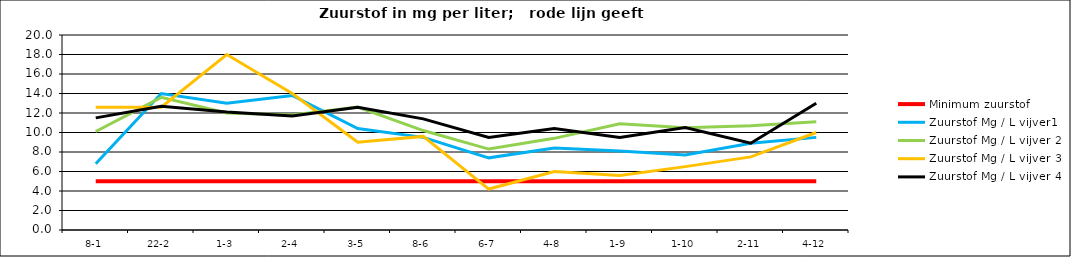
| Category | Minimum zuurstof | Zuurstof Mg / L vijver1 | Zuurstof Mg / L vijver 2 | Zuurstof Mg / L vijver 3 | Zuurstof Mg / L vijver 4 |
|---|---|---|---|---|---|
| 8-1 | 5 | 6.8 | 10.1 | 12.6 | 11.5 |
| 22-2 | 5 | 14 | 13.6 | 12.6 | 12.7 |
| 1-3 | 5 | 13 | 12 | 18 | 12.1 |
| 2-4 | 5 | 13.8 | 11.8 | 14 | 11.7 |
| 3-5 | 5 | 10.4 | 12.6 | 9 | 12.6 |
| 8-6 | 5 | 9.5 | 10.2 | 9.6 | 11.4 |
| 6-7 | 5 | 7.4 | 8.3 | 4.2 | 9.5 |
| 4-8 | 5 | 8.4 | 9.4 | 6 | 10.4 |
| 1-9 | 5 | 8.1 | 10.9 | 5.6 | 9.5 |
| 1-10 | 5 | 7.7 | 10.5 | 6.5 | 10.5 |
| 2-11 | 5 | 8.9 | 10.7 | 7.5 | 8.9 |
| 4-12 | 5 | 9.5 | 11.1 | 10 | 13 |